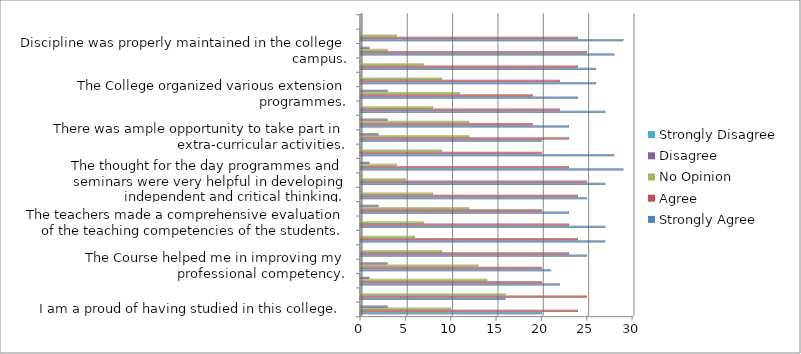
| Category | Strongly Agree  | Agree | No Opinion  | Disagree | Strongly Disagree  |
|---|---|---|---|---|---|
| I am a proud of having studied in this college. | 20 | 24 | 10 | 3 | 0 |
| There existed cordial relation between the staff and students.  | 16 | 25 | 16 | 0 | 0 |
| The institution helped me to fulfill my ambition of becoming a teacher. | 22 | 20 | 14 | 1 | 0 |
| The Course helped me in improving my professional competency. | 21 | 20 | 13 | 3 | 0 |
| The internal assessment of this college is balanced and objective. | 25 | 23 | 9 | 0 | 0 |
| The library facilities are adequate. | 27 | 24 | 6 | 0 | 0 |
| The teachers made a comprehensive evaluation of the teaching competencies of the students. | 27 | 23 | 7 | 0 | 0 |
| The teachers devoted extra time to render guidance. | 23 | 20 | 12 | 2 | 0 |
| Teacher adopted several innovative practices while teaching. | 25 | 24 | 8 | 0 | 0 |
| The thought for the day programmes and seminars were very helpful in developing independent and critical thinking. | 27 | 25 | 5 | 0 | 0 |
| The infrastructure facilities were adequate. | 29 | 23 | 4 | 1 | 0 |
| The educational tour proved to be informative. | 28 | 20 | 9 | 0 | 0 |
| There was ample opportunity to take part in extra-curricular activities. | 20 | 23 | 12 | 2 | 0 |
|  | 23 | 19 | 12 | 3 | 0 |
| There are adequate facilities for physical training and games. | 27 | 22 | 8 | 0 | 0 |
| The College organized various extension programmes. | 24 | 19 | 11 | 3 | 0 |
| The organization of various clubs in the college encouraged me to develop my intellectual and social skill. | 26 | 22 | 9 | 0 | 0 |
| Top Scores in the University Examination are felicitated. | 26 | 24 | 7 | 0 | 0 |
| Discipline was properly maintained in the college campus. | 28 | 25 | 3 | 1 | 0 |
| I often cherished glorious moments of my life in the college. | 29 | 24 | 4 | 0 | 0 |